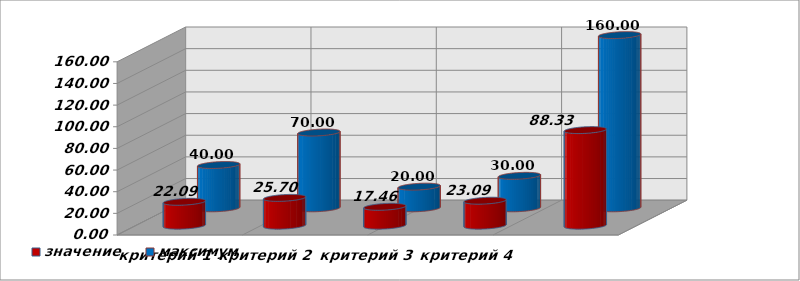
| Category | значение | максимум |
|---|---|---|
| критерий 1 | 22.091 | 40 |
| критерий 2 | 25.699 | 70 |
| критерий 3 | 17.458 | 20 |
| критерий 4 | 23.087 | 30 |